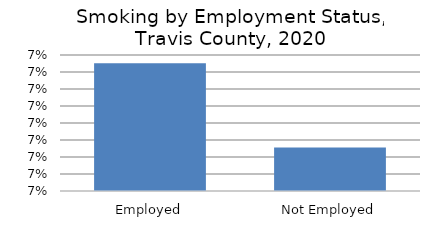
| Category | Series 0 |
|---|---|
| Employed | 0.068 |
| Not Employed | 0.067 |